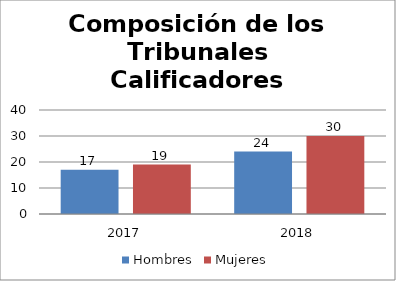
| Category | Hombres | Mujeres |
|---|---|---|
| 2017.0 | 17 | 19 |
| 2018.0 | 24 | 30 |